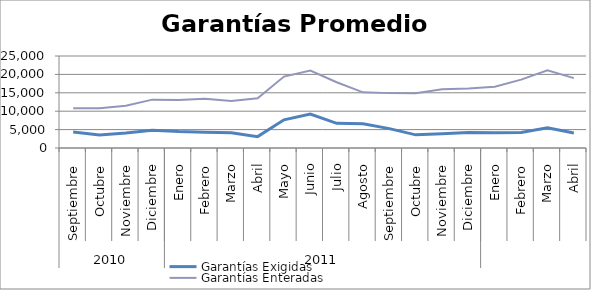
| Category | Garantías Exigidas | Garantías Enteradas |
|---|---|---|
| 0 | 4372.607 | 10829.062 |
| 1 | 3557.93 | 10787.9 |
| 2 | 4056.528 | 11463.422 |
| 3 | 4832.111 | 13142.881 |
| 4 | 4466.32 | 13061.162 |
| 5 | 4313.718 | 13357.444 |
| 6 | 4162.491 | 12796.251 |
| 7 | 3090.395 | 13495.263 |
| 8 | 7655.186 | 19416.342 |
| 9 | 9198.096 | 21035.301 |
| 10 | 6699.851 | 17866.843 |
| 11 | 6615.292 | 15119.839 |
| 12 | 5266.973 | 14911.639 |
| 13 | 3572.137 | 14861.465 |
| 14 | 3876.388 | 15976.819 |
| 15 | 4182.413 | 16147.351 |
| 16 | 4146.8 | 16662.483 |
| 17 | 4190.531 | 18572.749 |
| 18 | 5482.211 | 21128.648 |
| 19 | 4079.038 | 18997.51 |